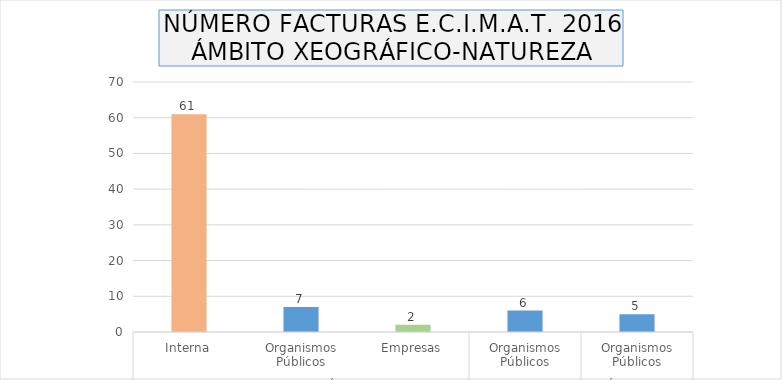
| Category | Series 0 |
|---|---|
| 0 | 61 |
| 1 | 7 |
| 2 | 2 |
| 3 | 6 |
| 4 | 5 |